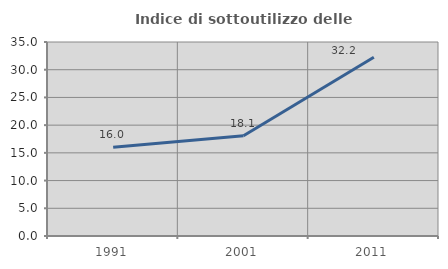
| Category | Indice di sottoutilizzo delle abitazioni  |
|---|---|
| 1991.0 | 16.017 |
| 2001.0 | 18.087 |
| 2011.0 | 32.245 |